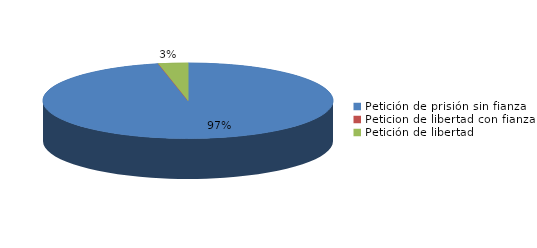
| Category | Series 0 |
|---|---|
| Petición de prisión sin fianza | 118 |
| Peticion de libertad con fianza | 0 |
| Petición de libertad | 4 |